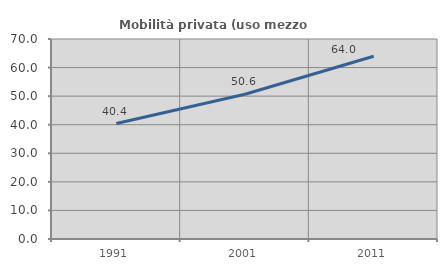
| Category | Mobilità privata (uso mezzo privato) |
|---|---|
| 1991.0 | 40.404 |
| 2001.0 | 50.649 |
| 2011.0 | 63.953 |